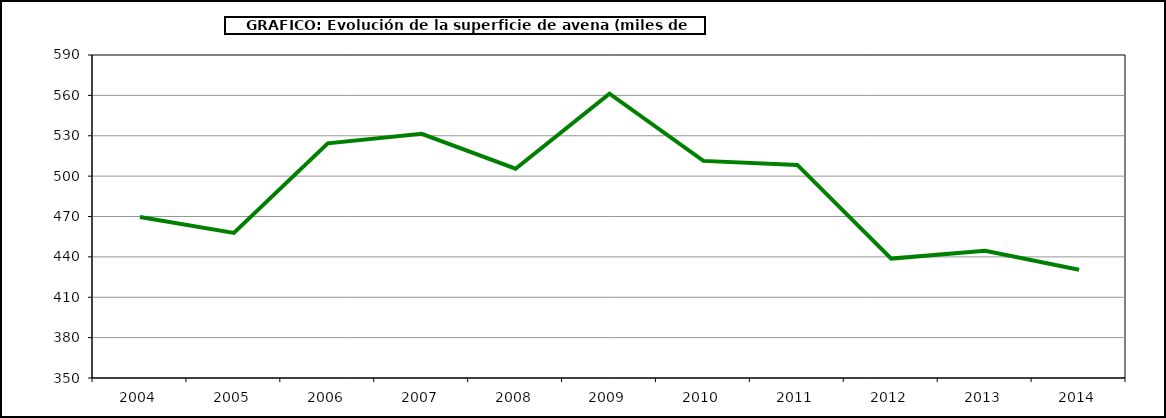
| Category | Superficie |
|---|---|
| 2004.0 | 469.605 |
| 2005.0 | 457.847 |
| 2006.0 | 524.389 |
| 2007.0 | 531.432 |
| 2008.0 | 505.511 |
| 2009.0 | 561.238 |
| 2010.0 | 511.329 |
| 2011.0 | 508.344 |
| 2012.0 | 438.745 |
| 2013.0 | 444.474 |
| 2014.0 | 430.419 |